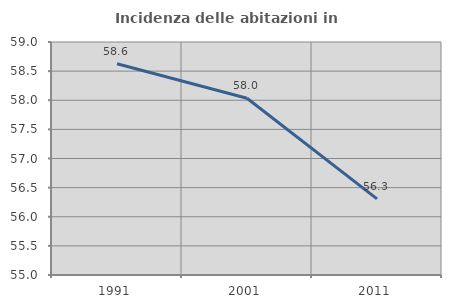
| Category | Incidenza delle abitazioni in proprietà  |
|---|---|
| 1991.0 | 58.626 |
| 2001.0 | 58.035 |
| 2011.0 | 56.307 |